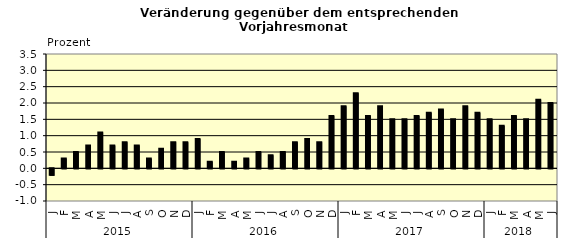
| Category | Series 0 |
|---|---|
| 0 | -0.2 |
| 1 | 0.3 |
| 2 | 0.5 |
| 3 | 0.7 |
| 4 | 1.1 |
| 5 | 0.7 |
| 6 | 0.8 |
| 7 | 0.7 |
| 8 | 0.3 |
| 9 | 0.6 |
| 10 | 0.8 |
| 11 | 0.8 |
| 12 | 0.9 |
| 13 | 0.2 |
| 14 | 0.5 |
| 15 | 0.2 |
| 16 | 0.3 |
| 17 | 0.5 |
| 18 | 0.4 |
| 19 | 0.5 |
| 20 | 0.8 |
| 21 | 0.9 |
| 22 | 0.8 |
| 23 | 1.6 |
| 24 | 1.9 |
| 25 | 2.3 |
| 26 | 1.6 |
| 27 | 1.9 |
| 28 | 1.5 |
| 29 | 1.5 |
| 30 | 1.6 |
| 31 | 1.7 |
| 32 | 1.8 |
| 33 | 1.5 |
| 34 | 1.9 |
| 35 | 1.7 |
| 36 | 1.5 |
| 37 | 1.3 |
| 38 | 1.6 |
| 39 | 1.5 |
| 40 | 2.1 |
| 41 | 2 |